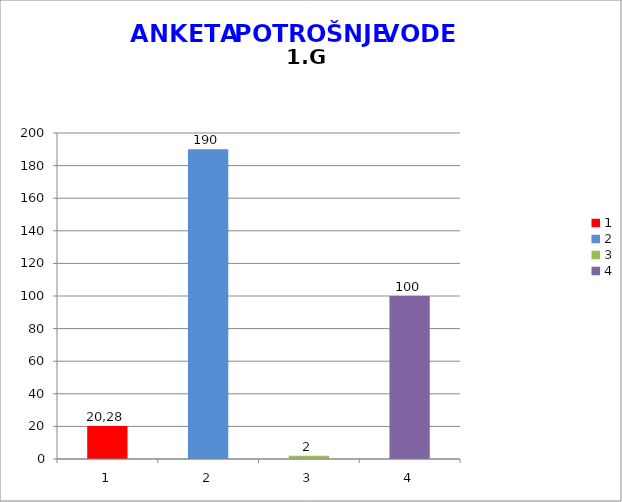
| Category | prosječna potrošnja | stvarna potrošnja | minimalna potrošnja | maksimalna potrošnja |
|---|---|---|---|---|
| 0 | 20.286 |  |  |  |
| 1 | 190 |  |  |  |
| 2 | 2 |  |  |  |
| 3 | 100 |  |  |  |